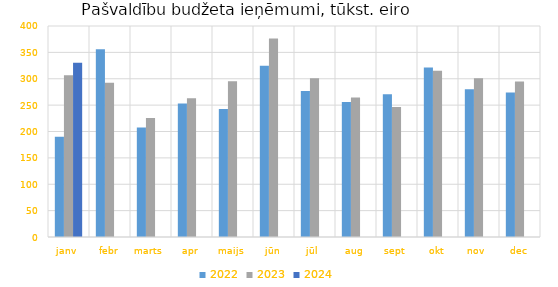
| Category | 2022 | 2023 | 2024 |
|---|---|---|---|
| janv | 190252.346 | 306465.267 | 330116.003 |
| febr | 356152.105 | 292294.044 | 0 |
| marts | 207474.213 | 225671.949 | 0 |
| apr | 253268.686 | 262816.149 | 0 |
| maijs | 242842.454 | 295042.686 | 0 |
| jūn | 324518.39 | 376093.33 | 0 |
| jūl | 276611.728 | 301143.927 | 0 |
| aug | 255749.732 | 264350.383 | 0 |
| sept | 270436.895 | 246209.854 | 0 |
| okt | 321133.295 | 315285.341 | 0 |
| nov | 280117.67 | 300948.206 | 0 |
| dec | 273764.648 | 294625.015 | 0 |